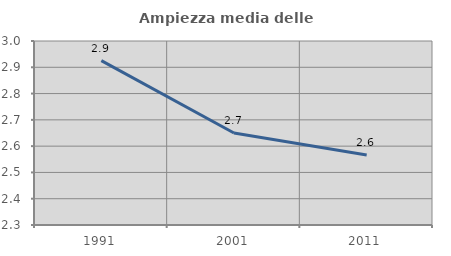
| Category | Ampiezza media delle famiglie |
|---|---|
| 1991.0 | 2.925 |
| 2001.0 | 2.65 |
| 2011.0 | 2.566 |